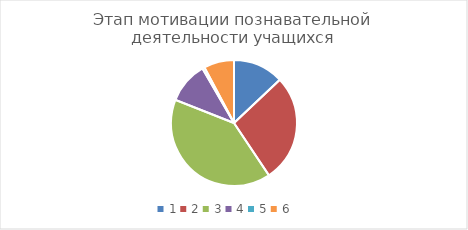
| Category | Series 0 |
|---|---|
| 0 | 0.142 |
| 1 | 0.303 |
| 2 | 0.442 |
| 3 | 0.117 |
| 4 | 0.006 |
| 5 | 0.085 |